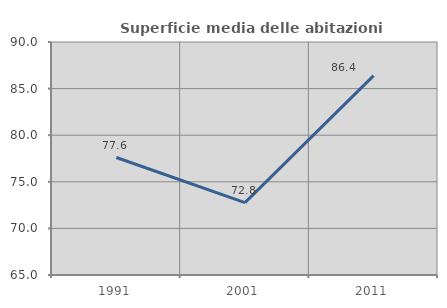
| Category | Superficie media delle abitazioni occupate |
|---|---|
| 1991.0 | 77.604 |
| 2001.0 | 72.773 |
| 2011.0 | 86.395 |